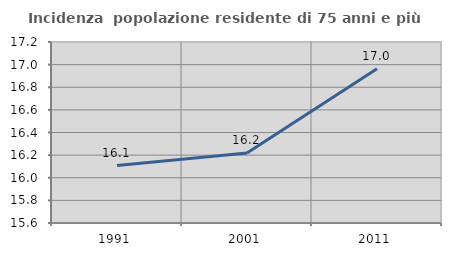
| Category | Incidenza  popolazione residente di 75 anni e più |
|---|---|
| 1991.0 | 16.108 |
| 2001.0 | 16.219 |
| 2011.0 | 16.964 |